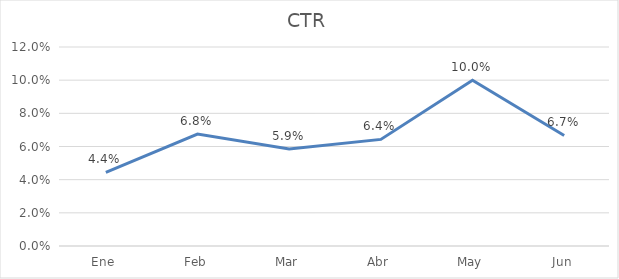
| Category | CTR |
|---|---|
| Ene | 0.044 |
| Feb | 0.068 |
| Mar | 0.059 |
| Abr | 0.064 |
| May | 0.1 |
| Jun | 0.067 |